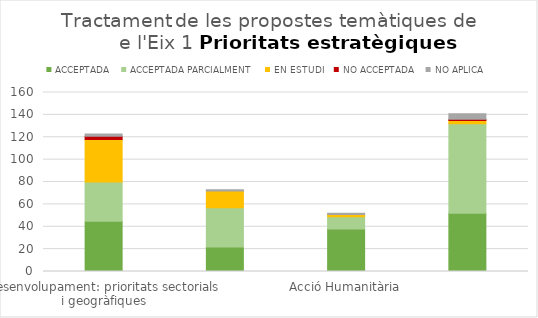
| Category | ACCEPTADA | ACCEPTADA PARCIALMENT | EN ESTUDI | NO ACCEPTADA | NO APLICA |
|---|---|---|---|---|---|
| Desenvolupament: prioritats sectorials i geogràfiques | 45 | 35 | 38 | 3 | 2 |
| Educació per al desenvolupament | 22 | 35 | 15 | 0 | 1 |
| Acció Humanitària | 38 | 11 | 2 | 0 | 1 |
| Reptes globals del desenvolupament | 52 | 80 | 3 | 1 | 5 |